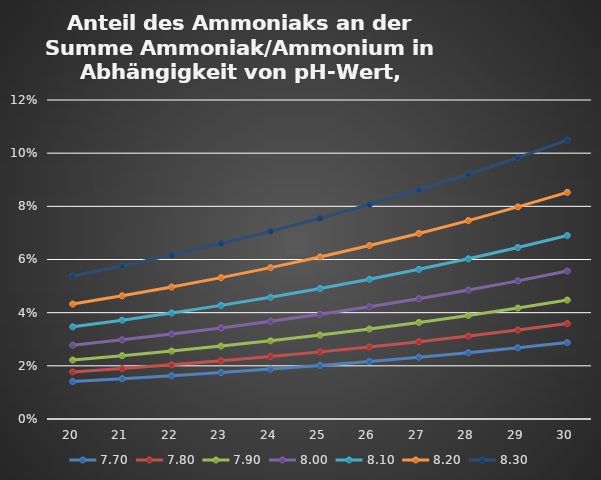
| Category | 7,70 | 7,80 | 7,90 | 8,00 | 8,10 | 8,20 | 8,30 |
|---|---|---|---|---|---|---|---|
| 20.0 | 0.014 | 0.018 | 0.022 | 0.028 | 0.035 | 0.043 | 0.054 |
| 21.0 | 0.015 | 0.019 | 0.024 | 0.03 | 0.037 | 0.046 | 0.058 |
| 22.0 | 0.016 | 0.02 | 0.026 | 0.032 | 0.04 | 0.05 | 0.062 |
| 23.0 | 0.017 | 0.022 | 0.027 | 0.034 | 0.043 | 0.053 | 0.066 |
| 24.0 | 0.019 | 0.024 | 0.029 | 0.037 | 0.046 | 0.057 | 0.071 |
| 25.0 | 0.02 | 0.025 | 0.032 | 0.039 | 0.049 | 0.061 | 0.075 |
| 26.0 | 0.022 | 0.027 | 0.034 | 0.042 | 0.053 | 0.065 | 0.081 |
| 27.0 | 0.023 | 0.029 | 0.036 | 0.045 | 0.056 | 0.07 | 0.086 |
| 28.0 | 0.025 | 0.031 | 0.039 | 0.049 | 0.06 | 0.075 | 0.092 |
| 29.0 | 0.027 | 0.033 | 0.042 | 0.052 | 0.065 | 0.08 | 0.098 |
| 30.0 | 0.029 | 0.036 | 0.045 | 0.056 | 0.069 | 0.085 | 0.105 |